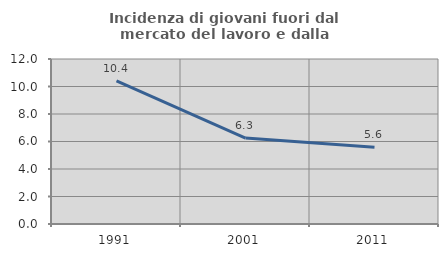
| Category | Incidenza di giovani fuori dal mercato del lavoro e dalla formazione  |
|---|---|
| 1991.0 | 10.403 |
| 2001.0 | 6.25 |
| 2011.0 | 5.578 |